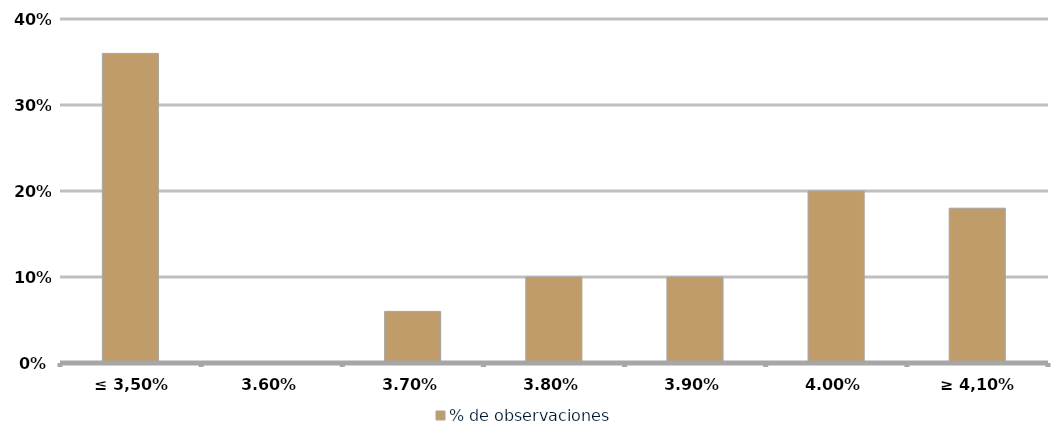
| Category | % de observaciones  |
|---|---|
| ≤ 3,50% | 0.36 |
| 3,60% | 0 |
| 3,70% | 0.06 |
| 3,80% | 0.1 |
| 3,90% | 0.1 |
| 4,00% | 0.2 |
| ≥ 4,10% | 0.18 |